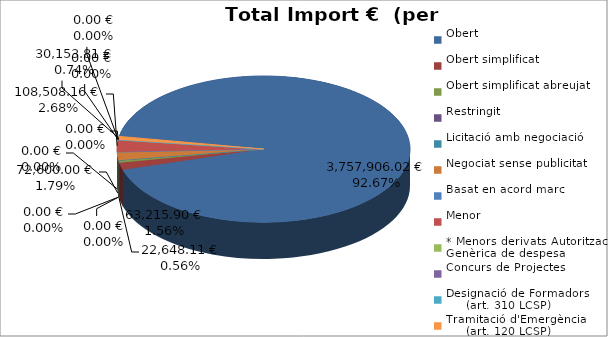
| Category | Total preu
(amb IVA) |
|---|---|
| Obert | 3757906.02 |
| Obert simplificat | 63215.9 |
| Obert simplificat abreujat | 22648.11 |
| Restringit | 0 |
| Licitació amb negociació | 0 |
| Negociat sense publicitat | 72600 |
| Basat en acord marc | 0 |
| Menor | 108508.16 |
| * Menors derivats Autorització Genèrica de despesa | 0 |
| Concurs de Projectes | 0 |
| Designació de Formadors
     (art. 310 LCSP) | 0 |
| Tramitació d'Emergència
     (art. 120 LCSP) | 30153.81 |